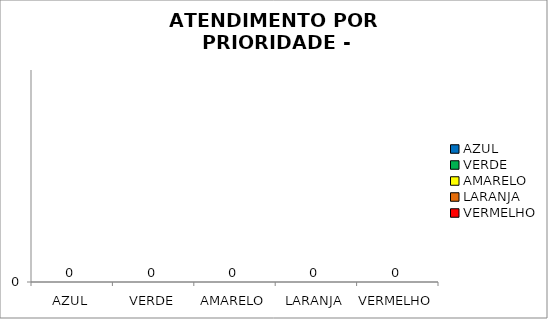
| Category | Total Regional: |
|---|---|
| AZUL | 0 |
| VERDE | 0 |
| AMARELO | 0 |
| LARANJA | 0 |
| VERMELHO | 0 |